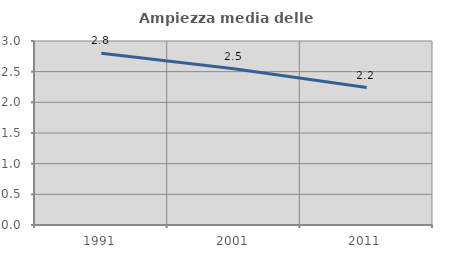
| Category | Ampiezza media delle famiglie |
|---|---|
| 1991.0 | 2.8 |
| 2001.0 | 2.549 |
| 2011.0 | 2.241 |